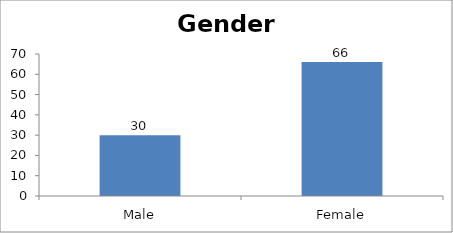
| Category | Gender |
|---|---|
| Male | 30 |
| Female | 66 |